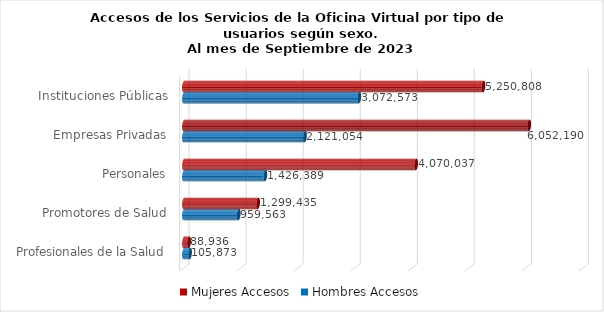
| Category | Mujeres | Hombres |
|---|---|---|
| Instituciones Públicas | 5250808 | 3072573 |
| Empresas Privadas | 6052190 | 2121054 |
| Personales | 4070037 | 1426389 |
| Promotores de Salud | 1299435 | 959563 |
| Profesionales de la Salud | 88936 | 105873 |